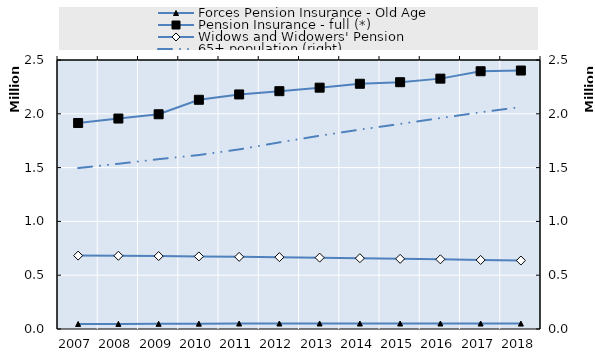
| Category | Forces Pension Insurance - Old Age | Pension Insurance - full (*) | Widows and Widowers' Pension  |
|---|---|---|---|
| 2007.0 | 46695 | 1914278 | 682155 |
| 2008.0 | 47373 | 1955994 | 680542 |
| 2009.0 | 48013 | 1995764 | 677766 |
| 2010.0 | 49672 | 2130196 | 674385 |
| 2011.0 | 50918 | 2179824 | 670529 |
| 2012.0 | 51078 | 2210280 | 667959 |
| 2013.0 | 51221 | 2242889 | 663244 |
| 2014.0 | 50888 | 2279101 | 658252 |
| 2015.0 | 51046 | 2293578 | 651989 |
| 2016.0 | 51075 | 2326840 | 647800 |
| 2017.0 | 50896 | 2395517 | 641604 |
| 2018.0 | 50424 | 2402119 | 636468 |